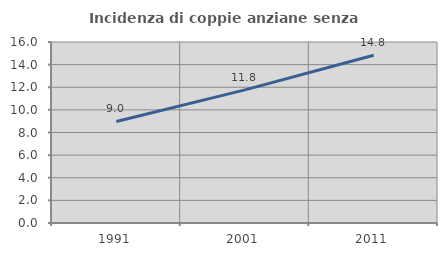
| Category | Incidenza di coppie anziane senza figli  |
|---|---|
| 1991.0 | 8.974 |
| 2001.0 | 11.765 |
| 2011.0 | 14.829 |